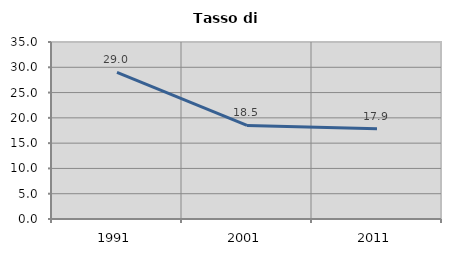
| Category | Tasso di disoccupazione   |
|---|---|
| 1991.0 | 28.977 |
| 2001.0 | 18.513 |
| 2011.0 | 17.855 |